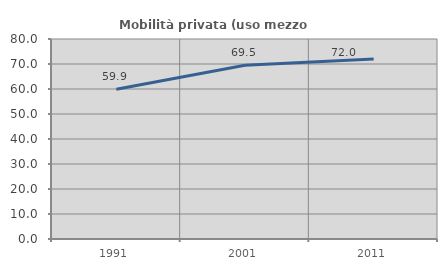
| Category | Mobilità privata (uso mezzo privato) |
|---|---|
| 1991.0 | 59.898 |
| 2001.0 | 69.468 |
| 2011.0 | 71.984 |